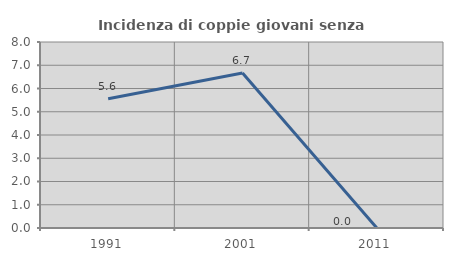
| Category | Incidenza di coppie giovani senza figli |
|---|---|
| 1991.0 | 5.556 |
| 2001.0 | 6.667 |
| 2011.0 | 0 |